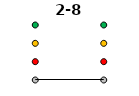
| Category | 0 | 1 | 2 | 3 | 2-8 |
|---|---|---|---|---|---|
| Time 1 | 0 | 1 | 2 | 3 | 0 |
| Time 2 | 0 | 1 | 2 | 3 | 0 |